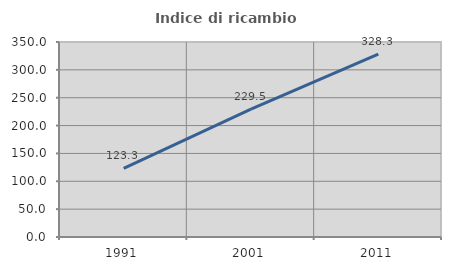
| Category | Indice di ricambio occupazionale  |
|---|---|
| 1991.0 | 123.288 |
| 2001.0 | 229.452 |
| 2011.0 | 328.276 |